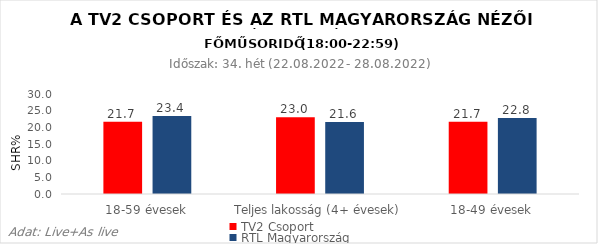
| Category | TV2 Csoport | RTL Magyarország |
|---|---|---|
| 18-59 évesek | 21.7 | 23.4 |
| Teljes lakosság (4+ évesek) | 23 | 21.6 |
| 18-49 évesek | 21.7 | 22.8 |